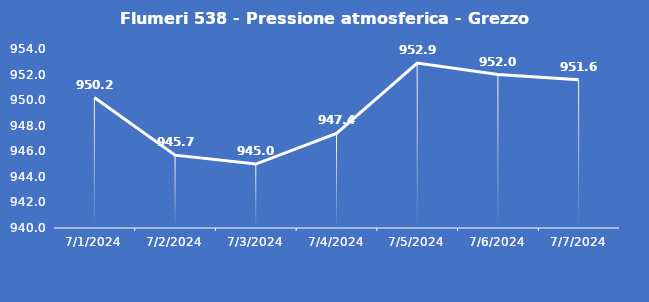
| Category | Flumeri 538 - Pressione atmosferica - Grezzo (hPa) |
|---|---|
| 7/1/24 | 950.2 |
| 7/2/24 | 945.7 |
| 7/3/24 | 945 |
| 7/4/24 | 947.4 |
| 7/5/24 | 952.9 |
| 7/6/24 | 952 |
| 7/7/24 | 951.6 |